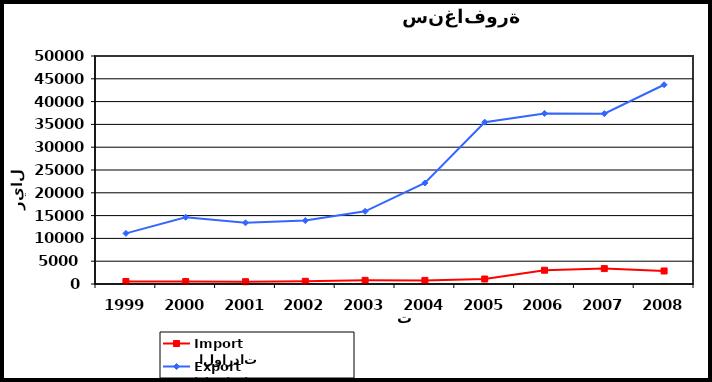
| Category |  الواردات           Import | الصادرات          Export |
|---|---|---|
| 1999.0 | 545 | 11107 |
| 2000.0 | 542 | 14632 |
| 2001.0 | 505 | 13429 |
| 2002.0 | 599 | 13905 |
| 2003.0 | 800 | 15940 |
| 2004.0 | 791 | 22147 |
| 2005.0 | 1094 | 35488 |
| 2006.0 | 3020 | 37405 |
| 2007.0 | 3381 | 37360 |
| 2008.0 | 2854 | 43693 |